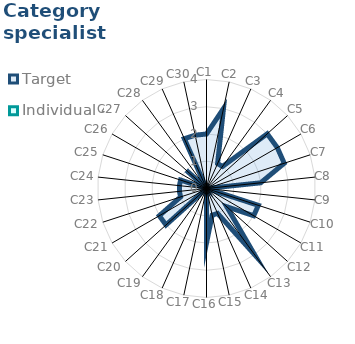
| Category | Target | Individual 4 |
|---|---|---|
| C1 | 2 | 0 |
| C2 | 3 | 0 |
| C3 | 1 | 0 |
| C4 | 1 | 0 |
| C5 | 3 | 0 |
| C6 | 3 | 0 |
| C7 | 3 | 0 |
| C8 | 2 | 0 |
| C9 | 0 | 0 |
| C10 | 2 | 0 |
| C11 | 2 | 0 |
| C12 | 1 | 0 |
| C13 | 3 | 0 |
| C14 | 1 | 0 |
| C15 | 1 | 0 |
| C16 | 2 | 0 |
| C17 | 0 | 0 |
| C18 | 0 | 0 |
| C19 | 0 | 0 |
| C20 | 2 | 0 |
| C21 | 2 | 0 |
| C22 | 1 | 0 |
| C23 | 1 | 0 |
| C24 | 1 | 0 |
| C25 | 1 | 0 |
| C26 | 0 | 0 |
| C27 | 1 | 0 |
| C28 | 0 | 0 |
| C29 | 2 | 0 |
| C30 | 2 | 0 |